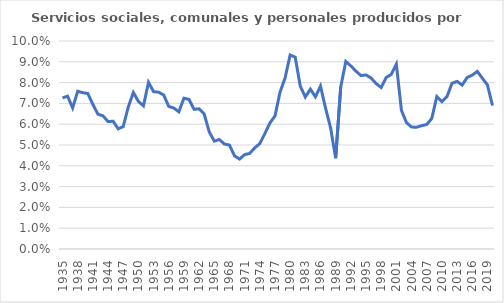
| Category | Servicios sociales, comunales y personales producidos por privados |
|---|---|
| 1935.0 | 0.073 |
| 1936.0 | 0.073 |
| 1937.0 | 0.068 |
| 1938.0 | 0.076 |
| 1939.0 | 0.075 |
| 1940.0 | 0.075 |
| 1941.0 | 0.069 |
| 1942.0 | 0.065 |
| 1943.0 | 0.064 |
| 1944.0 | 0.061 |
| 1945.0 | 0.061 |
| 1946.0 | 0.058 |
| 1947.0 | 0.059 |
| 1948.0 | 0.068 |
| 1949.0 | 0.075 |
| 1950.0 | 0.071 |
| 1951.0 | 0.069 |
| 1952.0 | 0.08 |
| 1953.0 | 0.076 |
| 1954.0 | 0.075 |
| 1955.0 | 0.074 |
| 1956.0 | 0.069 |
| 1957.0 | 0.068 |
| 1958.0 | 0.066 |
| 1959.0 | 0.073 |
| 1960.0 | 0.072 |
| 1961.0 | 0.067 |
| 1962.0 | 0.067 |
| 1963.0 | 0.065 |
| 1964.0 | 0.056 |
| 1965.0 | 0.052 |
| 1966.0 | 0.053 |
| 1967.0 | 0.05 |
| 1968.0 | 0.05 |
| 1969.0 | 0.045 |
| 1970.0 | 0.043 |
| 1971.0 | 0.045 |
| 1972.0 | 0.046 |
| 1973.0 | 0.049 |
| 1974.0 | 0.051 |
| 1975.0 | 0.055 |
| 1976.0 | 0.061 |
| 1977.0 | 0.064 |
| 1978.0 | 0.075 |
| 1979.0 | 0.082 |
| 1980.0 | 0.093 |
| 1981.0 | 0.092 |
| 1982.0 | 0.078 |
| 1983.0 | 0.073 |
| 1984.0 | 0.077 |
| 1985.0 | 0.073 |
| 1986.0 | 0.078 |
| 1987.0 | 0.068 |
| 1988.0 | 0.058 |
| 1989.0 | 0.044 |
| 1990.0 | 0.078 |
| 1991.0 | 0.09 |
| 1992.0 | 0.088 |
| 1993.0 | 0.086 |
| 1994.0 | 0.083 |
| 1995.0 | 0.084 |
| 1996.0 | 0.082 |
| 1997.0 | 0.08 |
| 1998.0 | 0.078 |
| 1999.0 | 0.082 |
| 2000.0 | 0.084 |
| 2001.0 | 0.089 |
| 2002.0 | 0.067 |
| 2003.0 | 0.061 |
| 2004.0 | 0.059 |
| 2005.0 | 0.059 |
| 2006.0 | 0.059 |
| 2007.0 | 0.06 |
| 2008.0 | 0.063 |
| 2009.0 | 0.073 |
| 2010.0 | 0.071 |
| 2011.0 | 0.073 |
| 2012.0 | 0.08 |
| 2013.0 | 0.081 |
| 2014.0 | 0.079 |
| 2015.0 | 0.082 |
| 2016.0 | 0.084 |
| 2017.0 | 0.085 |
| 2018.0 | 0.082 |
| 2019.0 | 0.079 |
| 2020.0 | 0.069 |